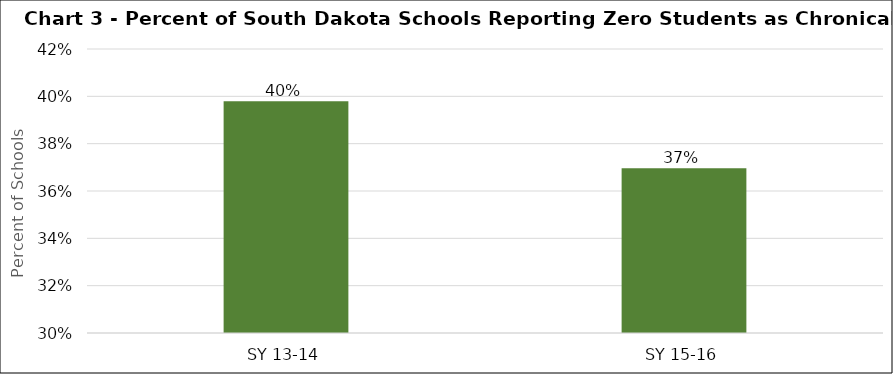
| Category | Series 0 |
|---|---|
| SY 13-14 | 0.398 |
| SY 15-16 | 0.37 |